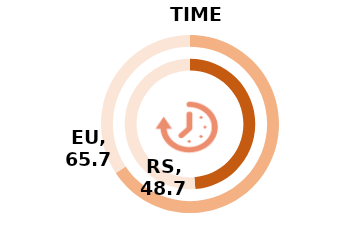
| Category | RS | Series 1 | EU |
|---|---|---|---|
| Index | 48.7 |  | 65.7 |
| Rest | 51.3 |  | 34.3 |